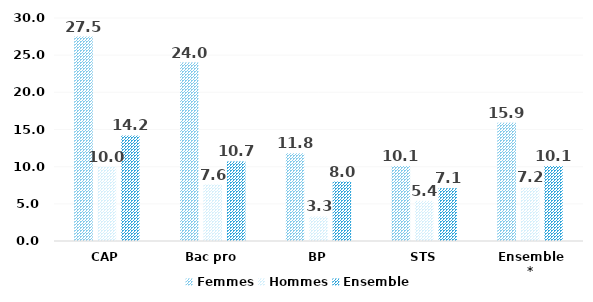
| Category | Femmes | Hommes | Ensemble |
|---|---|---|---|
| CAP | 27.5 | 10 | 14.2 |
| Bac pro | 24 | 7.6 | 10.7 |
| BP | 11.8 | 3.3 | 8 |
| STS | 10.1 | 5.4 | 7.1 |
| Ensemble* | 15.9 | 7.2 | 10.1 |